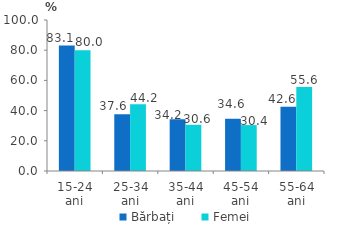
| Category | Bărbați | Femei |
|---|---|---|
| 15-24 ani | 83.1 | 80 |
| 25-34 ani | 37.6 | 44.2 |
| 35-44 ani | 34.2 | 30.6 |
| 45-54 ani | 34.6 | 30.4 |
| 55-64 ani | 42.6 | 55.6 |